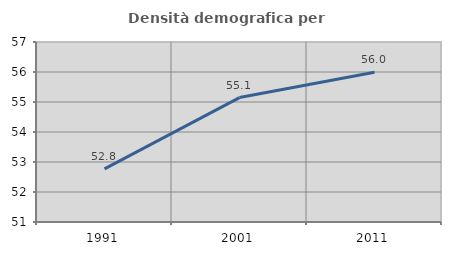
| Category | Densità demografica |
|---|---|
| 1991.0 | 52.771 |
| 2001.0 | 55.148 |
| 2011.0 | 55.991 |